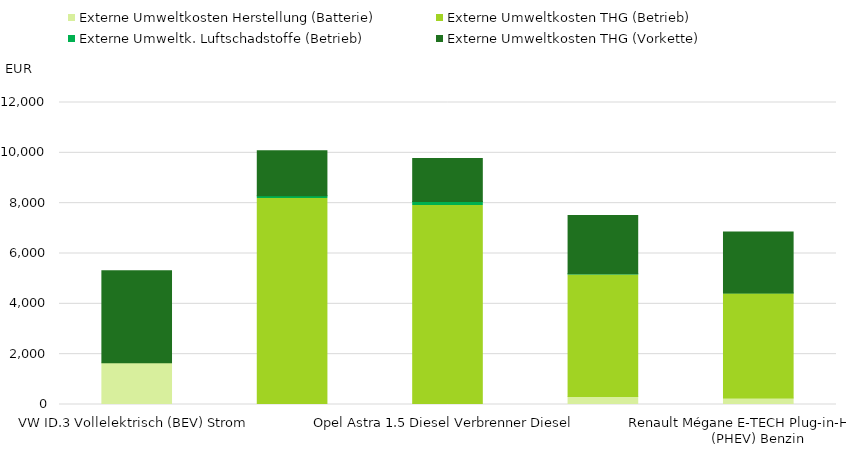
| Category | Externe Umweltkosten Herstellung (Batterie) | Externe Umweltkosten THG (Betrieb) | Externe Umweltk. Luftschadstoffe (Betrieb) | Externe Umweltkosten THG (Vorkette) |
|---|---|---|---|---|
| VW ID.3 Vollelektrisch (BEV) Strom | 1657.091 | 0 | 0 | 3658.713 |
| VW Golf 2.0 TDI Verbrenner Diesel | 0 | 8190 | 109.48 | 1785.349 |
| Opel Astra 1.5 Diesel Verbrenner Diesel | 0 | 7910 | 155.05 | 1706.001 |
| Kia Niro 1.6 GDI Plug-in-Hybrid (PHEV) Benzin | 320.727 | 4828.087 | 50.33 | 2313.875 |
| Renault Mégane E-TECH Plug-in-Hybrid (PHEV) Benzin | 261.927 | 4139.756 | 29.68 | 2425.214 |